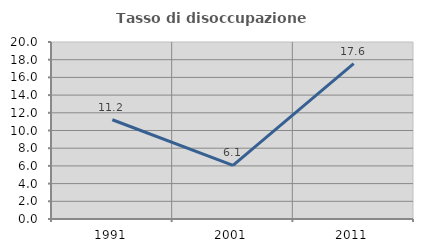
| Category | Tasso di disoccupazione giovanile  |
|---|---|
| 1991.0 | 11.217 |
| 2001.0 | 6.061 |
| 2011.0 | 17.553 |